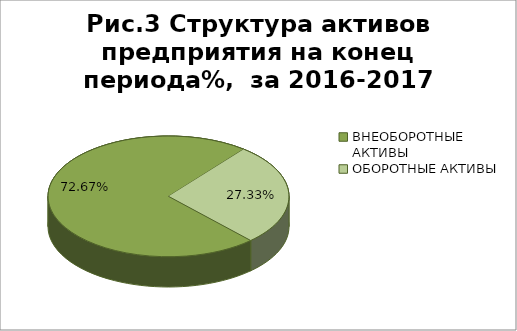
| Category | уд. вес. %,  за 2016-2017 г. |
|---|---|
| ВНЕОБОРОТНЫЕ АКТИВЫ | 0.727 |
| ОБОРОТНЫЕ АКТИВЫ | 0.273 |